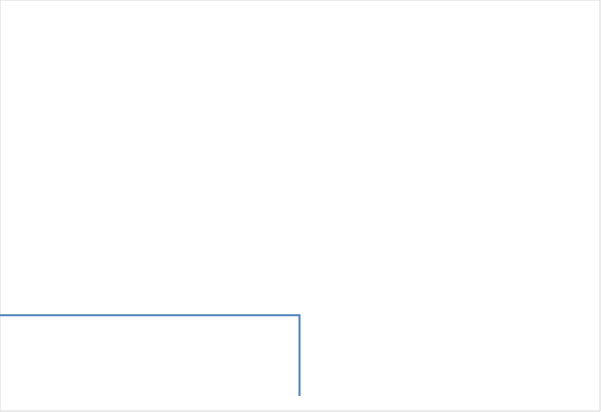
| Category | Series 0 |
|---|---|
| 0.0 | 1.692 |
| 6.0 | 1.692 |
| 6.0 | 0 |